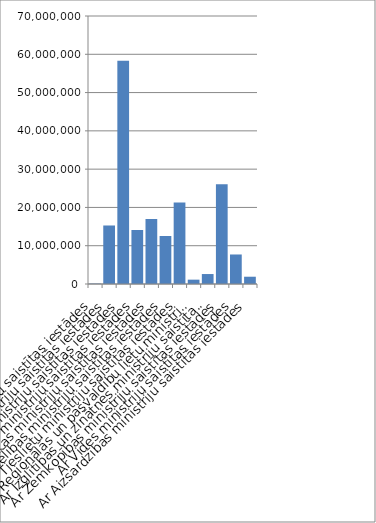
| Category | Series 0 |
|---|---|
| Ar Valsts kanceleju saistītas iestādes | 100510 |
| Ar Ārlietu ministriju saistītās iestādes | 15282668 |
| Ar Finanšu ministriju saistītas iestādes | 58307024 |
| Ar Labklājības ministriju saistītas iestādes | 14109223 |
| Ar Ekonomikas ministriju saistītas iestādes | 16956717 |
| Ar Veselības ministriju saistītas iestādes | 12543349 |
| Ar Tieslietu ministriju saistītas iestādes | 21303290 |
|  Ar Reģionālās un pašvaldību lietu ministriju saistītas iestādes | 1134245 |
| Ar Izglītības un zinātnes ministriju saistītas iestādes | 2601818 |
| Ar Zemkopības ministriju saistītas iestādes | 26079461 |
| Ar Vides ministriju saistītas iestādes | 7710668 |
| Ar Aizsardzības ministriju saistītās iestādes | 1901344 |